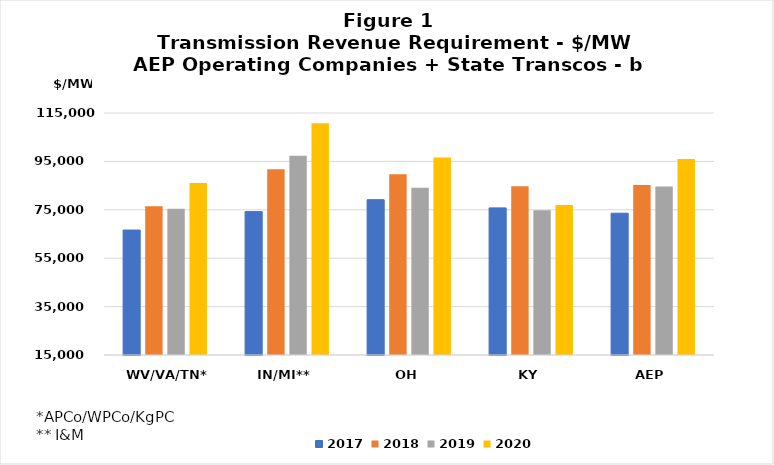
| Category | 2017 | 2018 | 2019 | 2020 |
|---|---|---|---|---|
|  WV/VA/TN*  | 66628.279 | 76487.565 | 75417.679 | 86109.619 |
|  IN/MI**  | 74255.312 | 91739.018 | 97382.125 | 110768.807 |
|  OH  | 79182.878 | 89707.394 | 84061.56 | 96581.686 |
|  KY  | 75791.583 | 84768.034 | 74852.259 | 76937.644 |
|  AEP  | 73597.012 | 85293.502 | 84586.177 | 96028.363 |